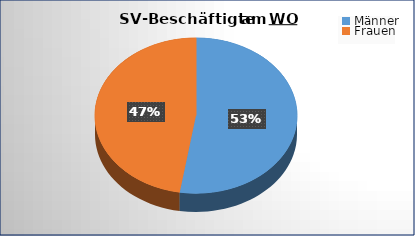
| Category | Series 0 |
|---|---|
| 0 | 37702 |
| 1 | 34018 |